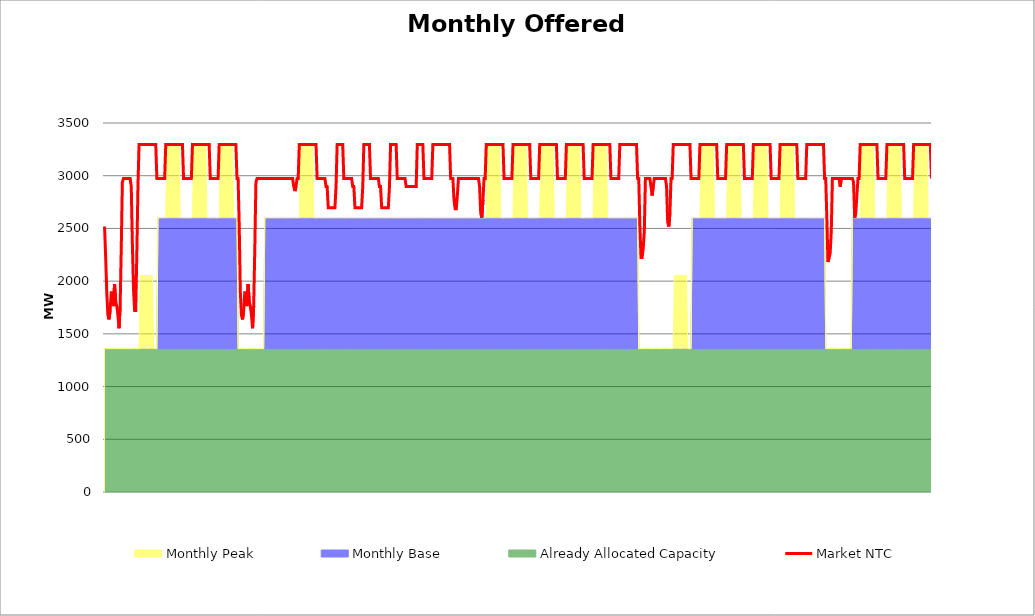
| Category | Market NTC |
|---|---|
| 0 | 2518 |
| 1 | 2224 |
| 2 | 1889 |
| 3 | 1679 |
| 4 | 1637 |
| 5 | 1721 |
| 6 | 1889 |
| 7 | 1889 |
| 8 | 1763 |
| 9 | 1973 |
| 10 | 1805 |
| 11 | 1763 |
| 12 | 1679 |
| 13 | 1553 |
| 14 | 1763 |
| 15 | 2308 |
| 16 | 2938 |
| 17 | 2973 |
| 18 | 2973 |
| 19 | 2973 |
| 20 | 2973 |
| 21 | 2973 |
| 22 | 2973 |
| 23 | 2973 |
| 24 | 2896 |
| 25 | 2350 |
| 26 | 1931 |
| 27 | 1721 |
| 28 | 1721 |
| 29 | 2266 |
| 30 | 2896 |
| 31 | 3297 |
| 32 | 3297 |
| 33 | 3297 |
| 34 | 3297 |
| 35 | 3297 |
| 36 | 3297 |
| 37 | 3297 |
| 38 | 3297 |
| 39 | 3297 |
| 40 | 3297 |
| 41 | 3297 |
| 42 | 3297 |
| 43 | 3297 |
| 44 | 3297 |
| 45 | 3297 |
| 46 | 3297 |
| 47 | 2973 |
| 48 | 2973 |
| 49 | 2973 |
| 50 | 2973 |
| 51 | 2973 |
| 52 | 2973 |
| 53 | 2973 |
| 54 | 2973 |
| 55 | 3297 |
| 56 | 3297 |
| 57 | 3297 |
| 58 | 3297 |
| 59 | 3297 |
| 60 | 3297 |
| 61 | 3297 |
| 62 | 3297 |
| 63 | 3297 |
| 64 | 3297 |
| 65 | 3297 |
| 66 | 3297 |
| 67 | 3297 |
| 68 | 3297 |
| 69 | 3297 |
| 70 | 3297 |
| 71 | 2973 |
| 72 | 2973 |
| 73 | 2973 |
| 74 | 2973 |
| 75 | 2973 |
| 76 | 2973 |
| 77 | 2973 |
| 78 | 2973 |
| 79 | 3297 |
| 80 | 3297 |
| 81 | 3297 |
| 82 | 3297 |
| 83 | 3297 |
| 84 | 3297 |
| 85 | 3297 |
| 86 | 3297 |
| 87 | 3297 |
| 88 | 3297 |
| 89 | 3297 |
| 90 | 3297 |
| 91 | 3297 |
| 92 | 3297 |
| 93 | 3297 |
| 94 | 3297 |
| 95 | 2973 |
| 96 | 2973 |
| 97 | 2973 |
| 98 | 2973 |
| 99 | 2973 |
| 100 | 2973 |
| 101 | 2973 |
| 102 | 2973 |
| 103 | 3297 |
| 104 | 3297 |
| 105 | 3297 |
| 106 | 3297 |
| 107 | 3297 |
| 108 | 3297 |
| 109 | 3297 |
| 110 | 3297 |
| 111 | 3297 |
| 112 | 3297 |
| 113 | 3297 |
| 114 | 3297 |
| 115 | 3297 |
| 116 | 3297 |
| 117 | 3297 |
| 118 | 3297 |
| 119 | 2973 |
| 120 | 2973 |
| 121 | 2527 |
| 122 | 1897 |
| 123 | 1679 |
| 124 | 1637 |
| 125 | 1721 |
| 126 | 1889 |
| 127 | 1889 |
| 128 | 1763 |
| 129 | 1973 |
| 130 | 1805 |
| 131 | 1763 |
| 132 | 1679 |
| 133 | 1553 |
| 134 | 1763 |
| 135 | 2308 |
| 136 | 2938 |
| 137 | 2973 |
| 138 | 2973 |
| 139 | 2973 |
| 140 | 2973 |
| 141 | 2973 |
| 142 | 2973 |
| 143 | 2973 |
| 144 | 2973 |
| 145 | 2973 |
| 146 | 2973 |
| 147 | 2973 |
| 148 | 2973 |
| 149 | 2973 |
| 150 | 2973 |
| 151 | 2973 |
| 152 | 2973 |
| 153 | 2973 |
| 154 | 2973 |
| 155 | 2973 |
| 156 | 2973 |
| 157 | 2973 |
| 158 | 2973 |
| 159 | 2973 |
| 160 | 2973 |
| 161 | 2973 |
| 162 | 2973 |
| 163 | 2973 |
| 164 | 2973 |
| 165 | 2973 |
| 166 | 2973 |
| 167 | 2973 |
| 168 | 2973 |
| 169 | 2973 |
| 170 | 2896 |
| 171 | 2854 |
| 172 | 2896 |
| 173 | 2973 |
| 174 | 2973 |
| 175 | 3297 |
| 176 | 3297 |
| 177 | 3297 |
| 178 | 3297 |
| 179 | 3297 |
| 180 | 3297 |
| 181 | 3297 |
| 182 | 3297 |
| 183 | 3297 |
| 184 | 3297 |
| 185 | 3297 |
| 186 | 3297 |
| 187 | 3297 |
| 188 | 3297 |
| 189 | 3297 |
| 190 | 3297 |
| 191 | 2973 |
| 192 | 2973 |
| 193 | 2973 |
| 194 | 2973 |
| 195 | 2973 |
| 196 | 2973 |
| 197 | 2973 |
| 198 | 2973 |
| 199 | 2897 |
| 200 | 2897 |
| 201 | 2697 |
| 202 | 2697 |
| 203 | 2697 |
| 204 | 2697 |
| 205 | 2697 |
| 206 | 2697 |
| 207 | 2697 |
| 208 | 2897 |
| 209 | 3297 |
| 210 | 3297 |
| 211 | 3297 |
| 212 | 3297 |
| 213 | 3297 |
| 214 | 3297 |
| 215 | 2973 |
| 216 | 2973 |
| 217 | 2973 |
| 218 | 2973 |
| 219 | 2973 |
| 220 | 2973 |
| 221 | 2973 |
| 222 | 2973 |
| 223 | 2897 |
| 224 | 2897 |
| 225 | 2697 |
| 226 | 2697 |
| 227 | 2697 |
| 228 | 2697 |
| 229 | 2697 |
| 230 | 2697 |
| 231 | 2697 |
| 232 | 2897 |
| 233 | 3297 |
| 234 | 3297 |
| 235 | 3297 |
| 236 | 3297 |
| 237 | 3297 |
| 238 | 3297 |
| 239 | 2973 |
| 240 | 2973 |
| 241 | 2973 |
| 242 | 2973 |
| 243 | 2973 |
| 244 | 2973 |
| 245 | 2973 |
| 246 | 2973 |
| 247 | 2897 |
| 248 | 2897 |
| 249 | 2697 |
| 250 | 2697 |
| 251 | 2697 |
| 252 | 2697 |
| 253 | 2697 |
| 254 | 2697 |
| 255 | 2697 |
| 256 | 2897 |
| 257 | 3297 |
| 258 | 3297 |
| 259 | 3297 |
| 260 | 3297 |
| 261 | 3297 |
| 262 | 3297 |
| 263 | 2973 |
| 264 | 2973 |
| 265 | 2973 |
| 266 | 2973 |
| 267 | 2973 |
| 268 | 2973 |
| 269 | 2973 |
| 270 | 2973 |
| 271 | 2897 |
| 272 | 2897 |
| 273 | 2897 |
| 274 | 2897 |
| 275 | 2897 |
| 276 | 2897 |
| 277 | 2897 |
| 278 | 2897 |
| 279 | 2897 |
| 280 | 2897 |
| 281 | 3297 |
| 282 | 3297 |
| 283 | 3297 |
| 284 | 3297 |
| 285 | 3297 |
| 286 | 3297 |
| 287 | 2973 |
| 288 | 2973 |
| 289 | 2973 |
| 290 | 2973 |
| 291 | 2973 |
| 292 | 2973 |
| 293 | 2973 |
| 294 | 2973 |
| 295 | 3297 |
| 296 | 3297 |
| 297 | 3297 |
| 298 | 3297 |
| 299 | 3297 |
| 300 | 3297 |
| 301 | 3297 |
| 302 | 3297 |
| 303 | 3297 |
| 304 | 3297 |
| 305 | 3297 |
| 306 | 3297 |
| 307 | 3297 |
| 308 | 3297 |
| 309 | 3297 |
| 310 | 3297 |
| 311 | 2973 |
| 312 | 2973 |
| 313 | 2973 |
| 314 | 2770 |
| 315 | 2686 |
| 316 | 2686 |
| 317 | 2812 |
| 318 | 2973 |
| 319 | 2973 |
| 320 | 2973 |
| 321 | 2973 |
| 322 | 2973 |
| 323 | 2973 |
| 324 | 2973 |
| 325 | 2973 |
| 326 | 2973 |
| 327 | 2973 |
| 328 | 2973 |
| 329 | 2973 |
| 330 | 2973 |
| 331 | 2973 |
| 332 | 2973 |
| 333 | 2973 |
| 334 | 2973 |
| 335 | 2973 |
| 336 | 2973 |
| 337 | 2896 |
| 338 | 2644 |
| 339 | 2602 |
| 340 | 2770 |
| 341 | 2973 |
| 342 | 2973 |
| 343 | 3297 |
| 344 | 3297 |
| 345 | 3297 |
| 346 | 3297 |
| 347 | 3297 |
| 348 | 3297 |
| 349 | 3297 |
| 350 | 3297 |
| 351 | 3297 |
| 352 | 3297 |
| 353 | 3297 |
| 354 | 3297 |
| 355 | 3297 |
| 356 | 3297 |
| 357 | 3297 |
| 358 | 3297 |
| 359 | 2973 |
| 360 | 2973 |
| 361 | 2973 |
| 362 | 2973 |
| 363 | 2973 |
| 364 | 2973 |
| 365 | 2973 |
| 366 | 2973 |
| 367 | 3297 |
| 368 | 3297 |
| 369 | 3297 |
| 370 | 3297 |
| 371 | 3297 |
| 372 | 3297 |
| 373 | 3297 |
| 374 | 3297 |
| 375 | 3297 |
| 376 | 3297 |
| 377 | 3297 |
| 378 | 3297 |
| 379 | 3297 |
| 380 | 3297 |
| 381 | 3297 |
| 382 | 3297 |
| 383 | 2973 |
| 384 | 2973 |
| 385 | 2973 |
| 386 | 2973 |
| 387 | 2973 |
| 388 | 2973 |
| 389 | 2973 |
| 390 | 2973 |
| 391 | 3297 |
| 392 | 3297 |
| 393 | 3297 |
| 394 | 3297 |
| 395 | 3297 |
| 396 | 3297 |
| 397 | 3297 |
| 398 | 3297 |
| 399 | 3297 |
| 400 | 3297 |
| 401 | 3297 |
| 402 | 3297 |
| 403 | 3297 |
| 404 | 3297 |
| 405 | 3297 |
| 406 | 3297 |
| 407 | 2973 |
| 408 | 2973 |
| 409 | 2973 |
| 410 | 2973 |
| 411 | 2973 |
| 412 | 2973 |
| 413 | 2973 |
| 414 | 2973 |
| 415 | 3297 |
| 416 | 3297 |
| 417 | 3297 |
| 418 | 3297 |
| 419 | 3297 |
| 420 | 3297 |
| 421 | 3297 |
| 422 | 3297 |
| 423 | 3297 |
| 424 | 3297 |
| 425 | 3297 |
| 426 | 3297 |
| 427 | 3297 |
| 428 | 3297 |
| 429 | 3297 |
| 430 | 3297 |
| 431 | 2973 |
| 432 | 2973 |
| 433 | 2973 |
| 434 | 2973 |
| 435 | 2973 |
| 436 | 2973 |
| 437 | 2973 |
| 438 | 2973 |
| 439 | 3297 |
| 440 | 3297 |
| 441 | 3297 |
| 442 | 3297 |
| 443 | 3297 |
| 444 | 3297 |
| 445 | 3297 |
| 446 | 3297 |
| 447 | 3297 |
| 448 | 3297 |
| 449 | 3297 |
| 450 | 3297 |
| 451 | 3297 |
| 452 | 3297 |
| 453 | 3297 |
| 454 | 3297 |
| 455 | 2973 |
| 456 | 2973 |
| 457 | 2973 |
| 458 | 2973 |
| 459 | 2973 |
| 460 | 2973 |
| 461 | 2973 |
| 462 | 2973 |
| 463 | 3297 |
| 464 | 3297 |
| 465 | 3297 |
| 466 | 3297 |
| 467 | 3297 |
| 468 | 3297 |
| 469 | 3297 |
| 470 | 3297 |
| 471 | 3297 |
| 472 | 3297 |
| 473 | 3297 |
| 474 | 3297 |
| 475 | 3297 |
| 476 | 3297 |
| 477 | 3297 |
| 478 | 3297 |
| 479 | 2973 |
| 480 | 2973 |
| 481 | 2527 |
| 482 | 2224 |
| 483 | 2224 |
| 484 | 2308 |
| 485 | 2476 |
| 486 | 2973 |
| 487 | 2973 |
| 488 | 2973 |
| 489 | 2973 |
| 490 | 2973 |
| 491 | 2896 |
| 492 | 2812 |
| 493 | 2896 |
| 494 | 2973 |
| 495 | 2973 |
| 496 | 2973 |
| 497 | 2973 |
| 498 | 2973 |
| 499 | 2973 |
| 500 | 2973 |
| 501 | 2973 |
| 502 | 2973 |
| 503 | 2973 |
| 504 | 2973 |
| 505 | 2896 |
| 506 | 2560 |
| 507 | 2518 |
| 508 | 2644 |
| 509 | 2973 |
| 510 | 2973 |
| 511 | 3297 |
| 512 | 3297 |
| 513 | 3297 |
| 514 | 3297 |
| 515 | 3297 |
| 516 | 3297 |
| 517 | 3297 |
| 518 | 3297 |
| 519 | 3297 |
| 520 | 3297 |
| 521 | 3297 |
| 522 | 3297 |
| 523 | 3297 |
| 524 | 3297 |
| 525 | 3297 |
| 526 | 3297 |
| 527 | 2973 |
| 528 | 2973 |
| 529 | 2973 |
| 530 | 2973 |
| 531 | 2973 |
| 532 | 2973 |
| 533 | 2973 |
| 534 | 2973 |
| 535 | 3297 |
| 536 | 3297 |
| 537 | 3297 |
| 538 | 3297 |
| 539 | 3297 |
| 540 | 3297 |
| 541 | 3297 |
| 542 | 3297 |
| 543 | 3297 |
| 544 | 3297 |
| 545 | 3297 |
| 546 | 3297 |
| 547 | 3297 |
| 548 | 3297 |
| 549 | 3297 |
| 550 | 3297 |
| 551 | 2973 |
| 552 | 2973 |
| 553 | 2973 |
| 554 | 2973 |
| 555 | 2973 |
| 556 | 2973 |
| 557 | 2973 |
| 558 | 2973 |
| 559 | 3297 |
| 560 | 3297 |
| 561 | 3297 |
| 562 | 3297 |
| 563 | 3297 |
| 564 | 3297 |
| 565 | 3297 |
| 566 | 3297 |
| 567 | 3297 |
| 568 | 3297 |
| 569 | 3297 |
| 570 | 3297 |
| 571 | 3297 |
| 572 | 3297 |
| 573 | 3297 |
| 574 | 3297 |
| 575 | 2973 |
| 576 | 2973 |
| 577 | 2973 |
| 578 | 2973 |
| 579 | 2973 |
| 580 | 2973 |
| 581 | 2973 |
| 582 | 2973 |
| 583 | 3297 |
| 584 | 3297 |
| 585 | 3297 |
| 586 | 3297 |
| 587 | 3297 |
| 588 | 3297 |
| 589 | 3297 |
| 590 | 3297 |
| 591 | 3297 |
| 592 | 3297 |
| 593 | 3297 |
| 594 | 3297 |
| 595 | 3297 |
| 596 | 3297 |
| 597 | 3297 |
| 598 | 3297 |
| 599 | 2973 |
| 600 | 2973 |
| 601 | 2973 |
| 602 | 2973 |
| 603 | 2973 |
| 604 | 2973 |
| 605 | 2973 |
| 606 | 2973 |
| 607 | 3297 |
| 608 | 3297 |
| 609 | 3297 |
| 610 | 3297 |
| 611 | 3297 |
| 612 | 3297 |
| 613 | 3297 |
| 614 | 3297 |
| 615 | 3297 |
| 616 | 3297 |
| 617 | 3297 |
| 618 | 3297 |
| 619 | 3297 |
| 620 | 3297 |
| 621 | 3297 |
| 622 | 3297 |
| 623 | 2973 |
| 624 | 2973 |
| 625 | 2973 |
| 626 | 2973 |
| 627 | 2973 |
| 628 | 2973 |
| 629 | 2973 |
| 630 | 2973 |
| 631 | 3297 |
| 632 | 3297 |
| 633 | 3297 |
| 634 | 3297 |
| 635 | 3297 |
| 636 | 3297 |
| 637 | 3297 |
| 638 | 3297 |
| 639 | 3297 |
| 640 | 3297 |
| 641 | 3297 |
| 642 | 3297 |
| 643 | 3297 |
| 644 | 3297 |
| 645 | 3297 |
| 646 | 3297 |
| 647 | 2973 |
| 648 | 2973 |
| 649 | 2602 |
| 650 | 2182 |
| 651 | 2224 |
| 652 | 2266 |
| 653 | 2476 |
| 654 | 2973 |
| 655 | 2973 |
| 656 | 2973 |
| 657 | 2973 |
| 658 | 2973 |
| 659 | 2973 |
| 660 | 2973 |
| 661 | 2896 |
| 662 | 2973 |
| 663 | 2973 |
| 664 | 2973 |
| 665 | 2973 |
| 666 | 2973 |
| 667 | 2973 |
| 668 | 2973 |
| 669 | 2973 |
| 670 | 2973 |
| 671 | 2973 |
| 672 | 2973 |
| 673 | 2938 |
| 674 | 2602 |
| 675 | 2644 |
| 676 | 2812 |
| 677 | 2973 |
| 678 | 2973 |
| 679 | 3297 |
| 680 | 3297 |
| 681 | 3297 |
| 682 | 3297 |
| 683 | 3297 |
| 684 | 3297 |
| 685 | 3297 |
| 686 | 3297 |
| 687 | 3297 |
| 688 | 3297 |
| 689 | 3297 |
| 690 | 3297 |
| 691 | 3297 |
| 692 | 3297 |
| 693 | 3297 |
| 694 | 3297 |
| 695 | 2973 |
| 696 | 2973 |
| 697 | 2973 |
| 698 | 2973 |
| 699 | 2973 |
| 700 | 2973 |
| 701 | 2973 |
| 702 | 2973 |
| 703 | 3297 |
| 704 | 3297 |
| 705 | 3297 |
| 706 | 3297 |
| 707 | 3297 |
| 708 | 3297 |
| 709 | 3297 |
| 710 | 3297 |
| 711 | 3297 |
| 712 | 3297 |
| 713 | 3297 |
| 714 | 3297 |
| 715 | 3297 |
| 716 | 3297 |
| 717 | 3297 |
| 718 | 3297 |
| 719 | 2973 |
| 720 | 2973 |
| 721 | 2973 |
| 722 | 2973 |
| 723 | 2973 |
| 724 | 2973 |
| 725 | 2973 |
| 726 | 2973 |
| 727 | 3297 |
| 728 | 3297 |
| 729 | 3297 |
| 730 | 3297 |
| 731 | 3297 |
| 732 | 3297 |
| 733 | 3297 |
| 734 | 3297 |
| 735 | 3297 |
| 736 | 3297 |
| 737 | 3297 |
| 738 | 3297 |
| 739 | 3297 |
| 740 | 3297 |
| 741 | 3297 |
| 742 | 3297 |
| 743 | 2973 |